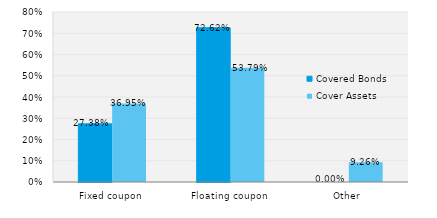
| Category | Covered Bonds | Cover Assets |
|---|---|---|
| Fixed coupon | 0.274 | 0.37 |
| Floating coupon | 0.726 | 0.538 |
| Other | 0 | 0.093 |